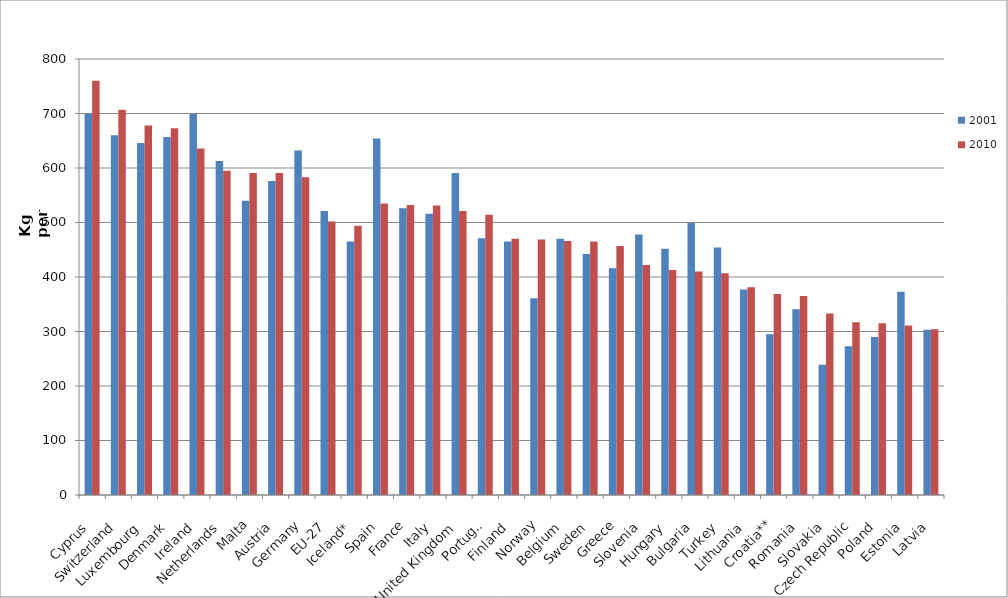
| Category | 2001 | 2010 |
|---|---|---|
| Cyprus | 699 | 760 |
| Switzerland | 660 | 707 |
| Luxembourg | 646 | 678 |
| Denmark | 657 | 673 |
| Ireland | 699 | 636 |
| Netherlands | 613 | 595 |
| Malta | 540 | 591 |
| Austria | 576 | 591 |
| Germany | 632 | 583 |
| EU-27 | 521 | 502 |
| Iceland* | 465 | 494 |
| Spain | 654 | 535 |
| France | 526 | 532 |
| Italy | 516 | 531 |
| United Kingdom | 591 | 521 |
| Portugal | 471 | 514 |
| Finland | 465 | 470 |
| Norway | 361 | 469 |
| Belgium | 470 | 466 |
| Sweden | 442 | 465 |
| Greece | 416 | 457 |
| Slovenia | 478 | 422 |
| Hungary | 452 | 413 |
| Bulgaria | 499 | 410 |
| Turkey | 454 | 407 |
| Lithuania | 377 | 381 |
| Croatia** | 295 | 369 |
| Romania | 341 | 365 |
| Slovakia | 239 | 333 |
| Czech Republic | 273 | 317 |
| Poland | 290 | 315 |
| Estonia | 373 | 311 |
| Latvia | 303 | 304 |